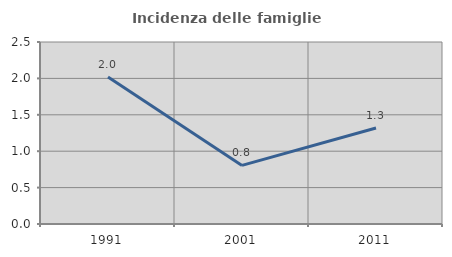
| Category | Incidenza delle famiglie numerose |
|---|---|
| 1991.0 | 2.019 |
| 2001.0 | 0.805 |
| 2011.0 | 1.318 |